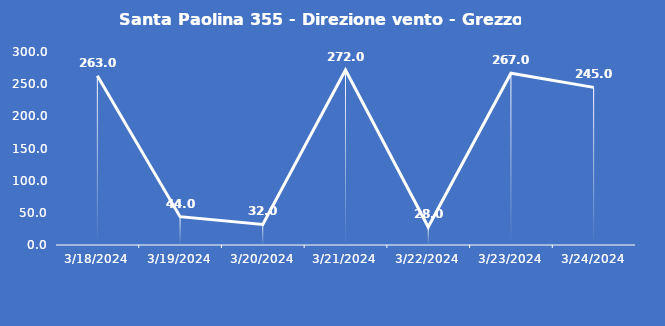
| Category | Santa Paolina 355 - Direzione vento - Grezzo (°N) |
|---|---|
| 3/18/24 | 263 |
| 3/19/24 | 44 |
| 3/20/24 | 32 |
| 3/21/24 | 272 |
| 3/22/24 | 28 |
| 3/23/24 | 267 |
| 3/24/24 | 245 |